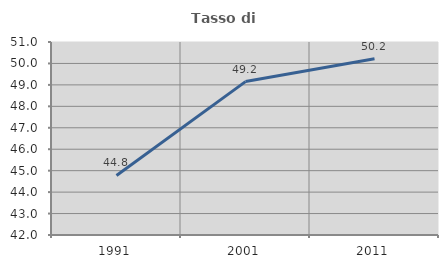
| Category | Tasso di occupazione   |
|---|---|
| 1991.0 | 44.776 |
| 2001.0 | 49.154 |
| 2011.0 | 50.217 |